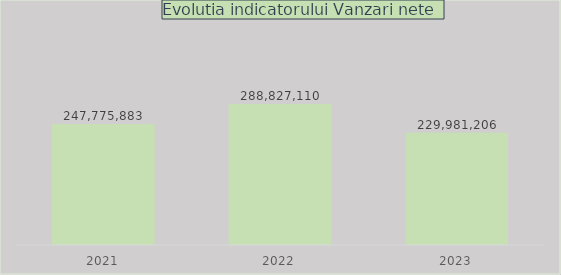
| Category | Series 0 |
|---|---|
| 2021.0 | 247775883 |
| 2022.0 | 288827110 |
| 2023.0 | 229981206 |